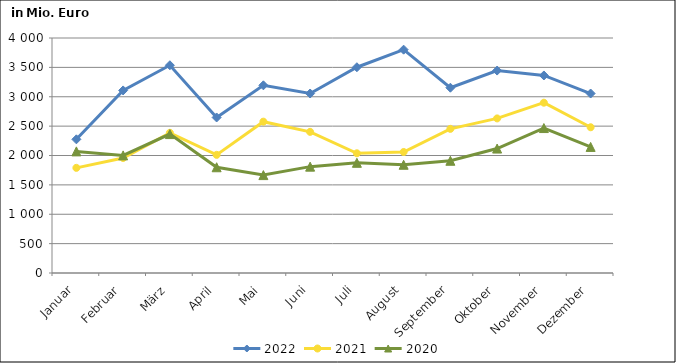
| Category | 2022 | 2021 | 2020 |
|---|---|---|---|
| Januar | 2275.105 | 1789.858 | 2069.972 |
| Februar | 3107.582 | 1957.586 | 2001.984 |
| März | 3535.986 | 2386.173 | 2364.376 |
| April | 2647.161 | 2010.959 | 1799.748 |
| Mai | 3194.49 | 2575.949 | 1666.373 |
| Juni | 3055.062 | 2402.43 | 1810.278 |
| Juli | 3502.325 | 2037.458 | 1875.601 |
| August | 3801.475 | 2059.435 | 1842.082 |
| September | 3153.823 | 2453.415 | 1910.175 |
| Oktober | 3445.674 | 2631.274 | 2117.992 |
| November | 3362.244 | 2898.914 | 2467.112 |
| Dezember | 3054.848 | 2480.746 | 2146.172 |